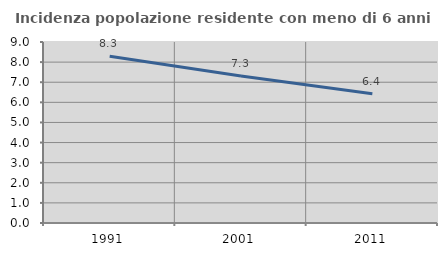
| Category | Incidenza popolazione residente con meno di 6 anni |
|---|---|
| 1991.0 | 8.287 |
| 2001.0 | 7.311 |
| 2011.0 | 6.423 |